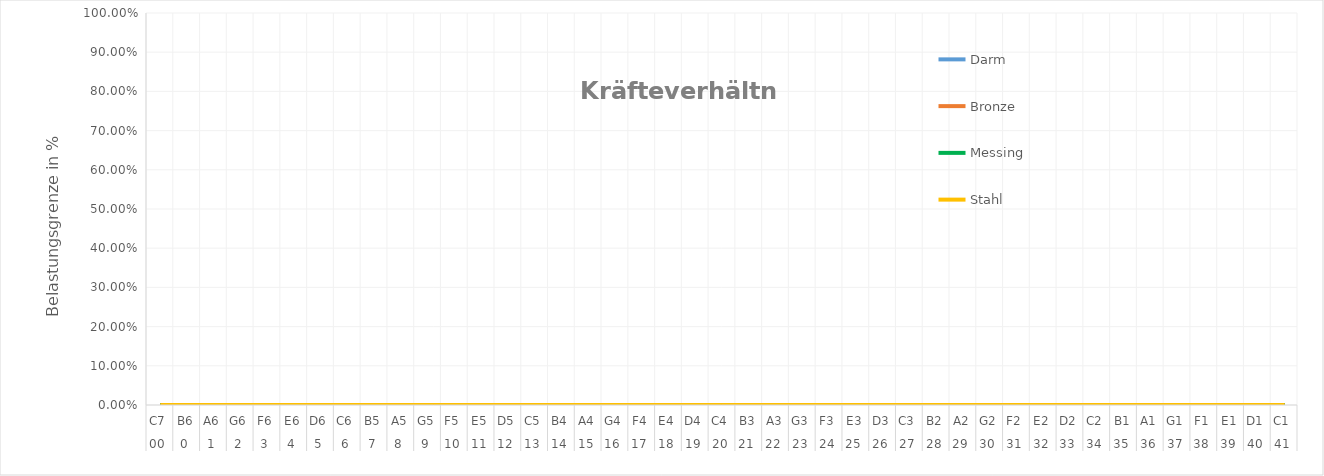
| Category | Darm | Bronze | Messing | Stahl |
|---|---|---|---|---|
| 0 | 0 | 0 | 0 | 0 |
| 1 | 0 | 0 | 0 | 0 |
| 2 | 0 | 0 | 0 | 0 |
| 3 | 0 | 0 | 0 | 0 |
| 4 | 0 | 0 | 0 | 0 |
| 5 | 0 | 0 | 0 | 0 |
| 6 | 0 | 0 | 0 | 0 |
| 7 | 0 | 0 | 0 | 0 |
| 8 | 0 | 0 | 0 | 0 |
| 9 | 0 | 0 | 0 | 0 |
| 10 | 0 | 0 | 0 | 0 |
| 11 | 0 | 0 | 0 | 0 |
| 12 | 0 | 0 | 0 | 0 |
| 13 | 0 | 0 | 0 | 0 |
| 14 | 0 | 0 | 0 | 0 |
| 15 | 0 | 0 | 0 | 0 |
| 16 | 0 | 0 | 0 | 0 |
| 17 | 0 | 0 | 0 | 0 |
| 18 | 0 | 0 | 0 | 0 |
| 19 | 0 | 0 | 0 | 0 |
| 20 | 0 | 0 | 0 | 0 |
| 21 | 0 | 0 | 0 | 0 |
| 22 | 0 | 0 | 0 | 0 |
| 23 | 0 | 0 | 0 | 0 |
| 24 | 0 | 0 | 0 | 0 |
| 25 | 0 | 0 | 0 | 0 |
| 26 | 0 | 0 | 0 | 0 |
| 27 | 0 | 0 | 0 | 0 |
| 28 | 0 | 0 | 0 | 0 |
| 29 | 0 | 0 | 0 | 0 |
| 30 | 0 | 0 | 0 | 0 |
| 31 | 0 | 0 | 0 | 0 |
| 32 | 0 | 0 | 0 | 0 |
| 33 | 0 | 0 | 0 | 0 |
| 34 | 0 | 0 | 0 | 0 |
| 35 | 0 | 0 | 0 | 0 |
| 36 | 0 | 0 | 0 | 0 |
| 37 | 0 | 0 | 0 | 0 |
| 38 | 0 | 0 | 0 | 0 |
| 39 | 0 | 0 | 0 | 0 |
| 40 | 0 | 0 | 0 | 0 |
| 41 | 0 | 0 | 0 | 0 |
| 42 | 0 | 0 | 0 | 0 |